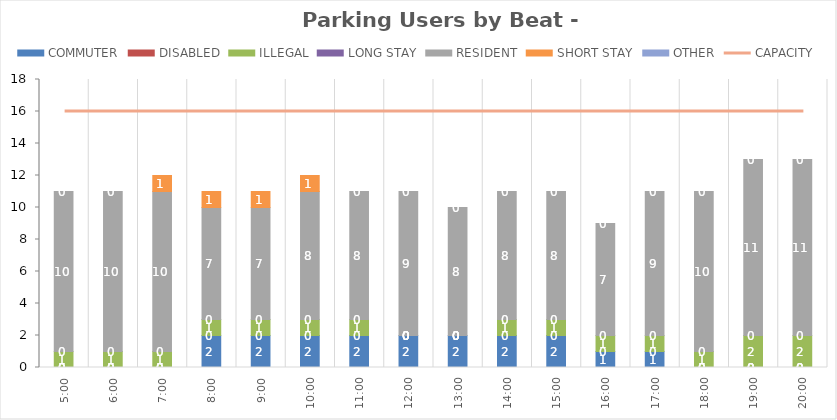
| Category | COMMUTER | DISABLED | ILLEGAL | LONG STAY | RESIDENT | SHORT STAY | OTHER |
|---|---|---|---|---|---|---|---|
| 0.20833333333333334 | 0 | 0 | 1 | 0 | 10 | 0 | 0 |
| 0.25 | 0 | 0 | 1 | 0 | 10 | 0 | 0 |
| 0.2916666666666667 | 0 | 0 | 1 | 0 | 10 | 1 | 0 |
| 0.3333333333333333 | 2 | 0 | 1 | 0 | 7 | 1 | 0 |
| 0.375 | 2 | 0 | 1 | 0 | 7 | 1 | 0 |
| 0.4166666666666667 | 2 | 0 | 1 | 0 | 8 | 1 | 0 |
| 0.4583333333333333 | 2 | 0 | 1 | 0 | 8 | 0 | 0 |
| 0.5 | 2 | 0 | 0 | 0 | 9 | 0 | 0 |
| 0.5416666666666666 | 2 | 0 | 0 | 0 | 8 | 0 | 0 |
| 0.5833333333333334 | 2 | 0 | 1 | 0 | 8 | 0 | 0 |
| 0.625 | 2 | 0 | 1 | 0 | 8 | 0 | 0 |
| 0.6666666666666666 | 1 | 0 | 1 | 0 | 7 | 0 | 0 |
| 0.7083333333333334 | 1 | 0 | 1 | 0 | 9 | 0 | 0 |
| 0.75 | 0 | 0 | 1 | 0 | 10 | 0 | 0 |
| 0.7916666666666666 | 0 | 0 | 2 | 0 | 11 | 0 | 0 |
| 0.8333333333333334 | 0 | 0 | 2 | 0 | 11 | 0 | 0 |